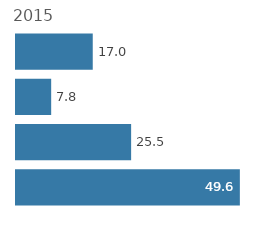
| Category | Series 0 |
|---|---|
| 0 | 49.645 |
| 1 | 25.532 |
| 2 | 7.801 |
| 3 | 17.021 |